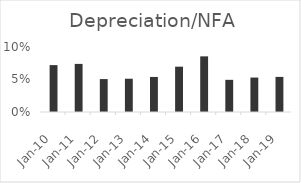
| Category | Depreciation/NFA (consistency) |
|---|---|
| 2010-03-31 | 0.072 |
| 2011-03-31 | 0.074 |
| 2012-03-31 | 0.051 |
| 2013-03-31 | 0.051 |
| 2014-03-31 | 0.054 |
| 2015-03-31 | 0.07 |
| 2016-03-31 | 0.086 |
| 2017-03-31 | 0.049 |
| 2018-03-31 | 0.053 |
| 2019-03-31 | 0.054 |